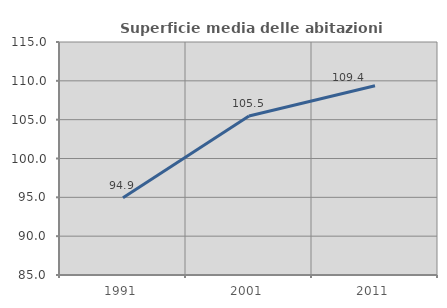
| Category | Superficie media delle abitazioni occupate |
|---|---|
| 1991.0 | 94.935 |
| 2001.0 | 105.473 |
| 2011.0 | 109.374 |